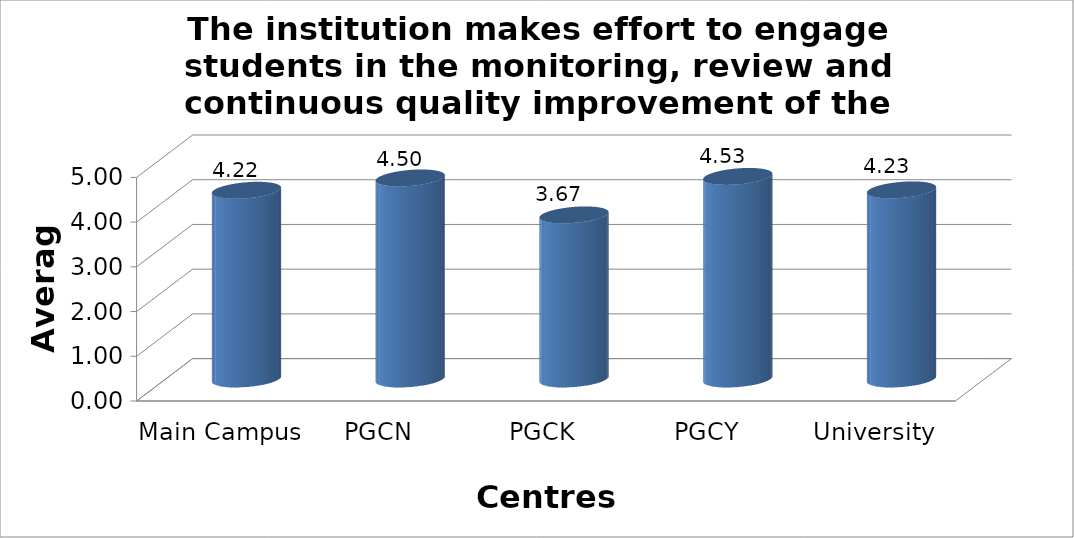
| Category | The institution makes effort to engage students in the monitoring, review and continuous quality improvement of the teaching learning process. |
|---|---|
| Main Campus | 4.22 |
| PGCN | 4.496 |
| PGCK | 3.669 |
| PGCY | 4.53 |
| University Avg | 4.229 |